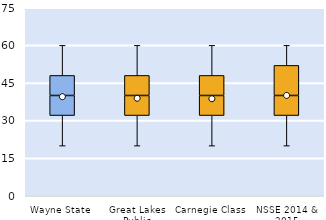
| Category | 25th | 50th | 75th |
|---|---|---|---|
| Wayne State | 32 | 8 | 8 |
| Great Lakes Public | 32 | 8 | 8 |
| Carnegie Class | 32 | 8 | 8 |
| NSSE 2014 & 2015 | 32 | 8 | 12 |